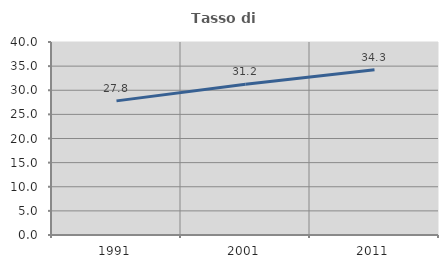
| Category | Tasso di occupazione   |
|---|---|
| 1991.0 | 27.796 |
| 2001.0 | 31.246 |
| 2011.0 | 34.258 |